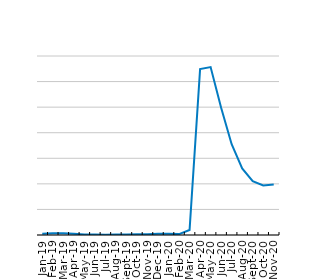
| Category | Short-Term Work  |
|---|---|
| 2019-01-01 | 26.562 |
| 2019-02-01 | 36.139 |
| 2019-03-01 | 35.85 |
| 2019-04-01 | 23.259 |
| 2019-05-01 | 11.964 |
| 2019-06-01 | 9.638 |
| 2019-07-01 | 6.328 |
| 2019-08-01 | 9.687 |
| 2019-09-01 | 10.839 |
| 2019-10-01 | 16.236 |
| 2019-11-01 | 16.219 |
| 2019-12-01 | 24.405 |
| 2020-01-01 | 24.847 |
| 2020-02-01 | 17.862 |
| 2020-03-01 | 96.636 |
| 2020-04-01 | 3243.126 |
| 2020-05-01 | 3282.817 |
| 2020-06-01 | 2486.854 |
| 2020-07-01 | 1774.865 |
| 2020-08-01 | 1302.755 |
| 2020-09-01 | 1051.71 |
| 2020-10-01 | 967.563 |
| 2020-11-01 | 989.337 |